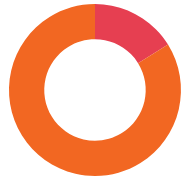
| Category | 35.700 lei |
|---|---|
| NESIGUR | 35700 |
| SIGUR | 185500 |